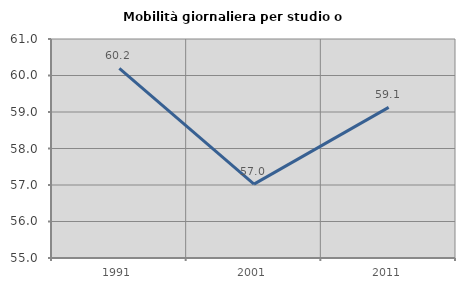
| Category | Mobilità giornaliera per studio o lavoro |
|---|---|
| 1991.0 | 60.194 |
| 2001.0 | 57.025 |
| 2011.0 | 59.128 |